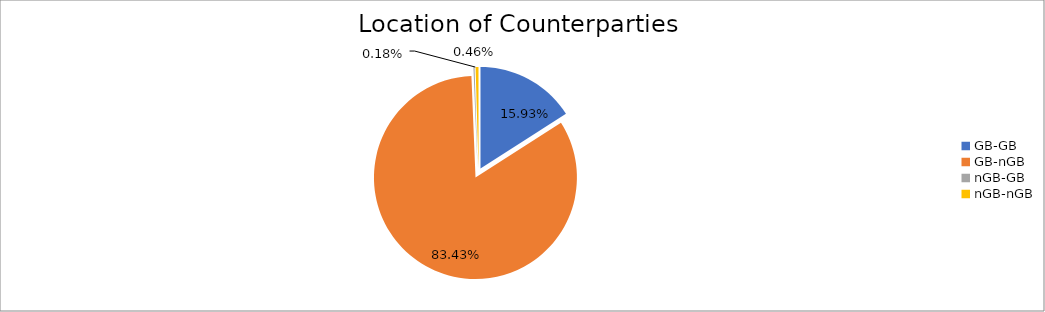
| Category | Series 0 |
|---|---|
| GB-GB | 1532502.064 |
| GB-nGB | 8025041.39 |
| nGB-GB | 17532.264 |
| nGB-nGB | 44180.124 |